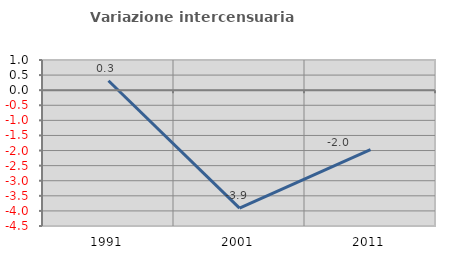
| Category | Variazione intercensuaria annua |
|---|---|
| 1991.0 | 0.314 |
| 2001.0 | -3.91 |
| 2011.0 | -1.966 |